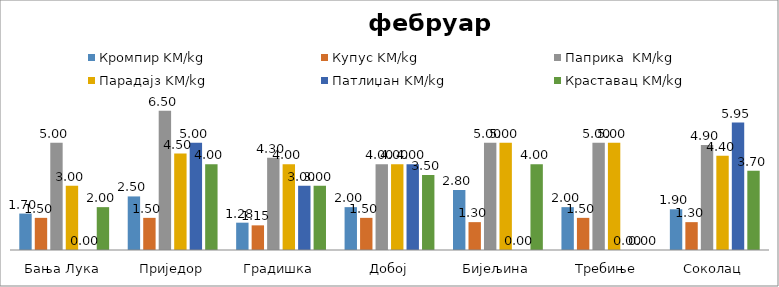
| Category | Кромпир | Купус | Паприка  | Парадајз | Патлиџан | Краставац |
|---|---|---|---|---|---|---|
| Бања Лука | 1.7 | 1.5 | 5 | 3 | 0 | 2 |
| Приједор | 2.5 | 1.5 | 6.5 | 4.5 | 5 | 4 |
| Градишка | 1.275 | 1.15 | 4.3 | 4 | 3 | 3 |
| Добој | 2 | 1.5 | 4 | 4 | 4 | 3.5 |
| Бијељина | 2.8 | 1.3 | 5 | 5 | 0 | 4 |
|  Требиње | 2 | 1.5 | 5 | 5 | 0 | 0 |
| Соколац | 1.9 | 1.3 | 4.9 | 4.4 | 5.95 | 3.7 |